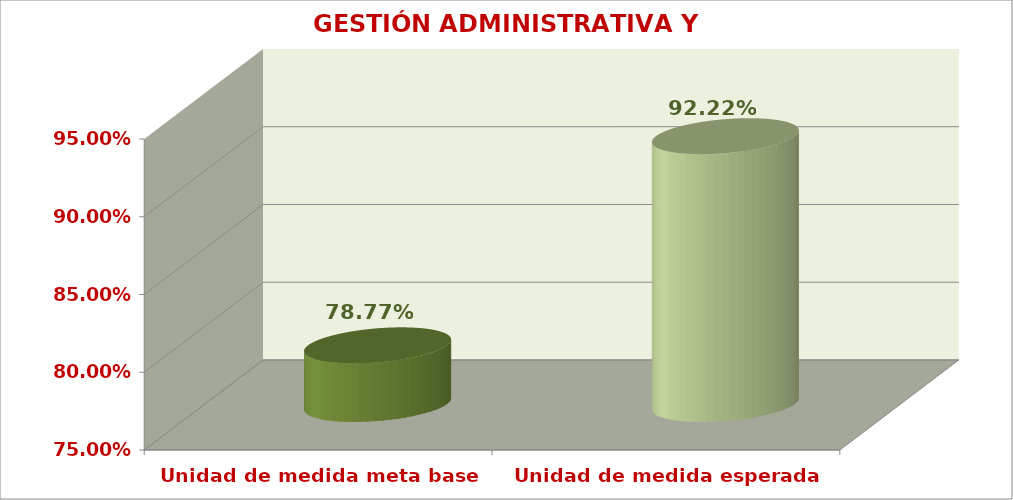
| Category | GESTIÓN ADMINISTRATIVA Y FINANCIERA |
|---|---|
| Unidad de medida meta base | 0.788 |
| Unidad de medida esperada | 0.922 |